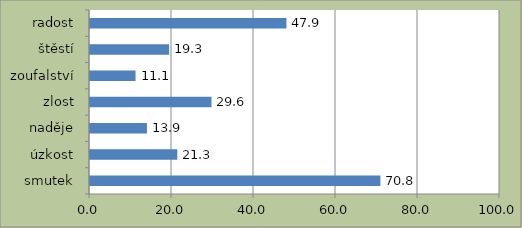
| Category | Series 0 |
|---|---|
| smutek | 70.833 |
| úzkost | 21.296 |
| naděje | 13.889 |
| zlost | 29.63 |
| zoufalství | 11.111 |
| štěstí | 19.298 |
| radost | 47.917 |